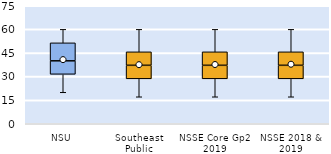
| Category | 25th | 50th | 75th |
|---|---|---|---|
| NSU | 31.429 | 8.571 | 11.429 |
| Southeast Public | 28.571 | 8.571 | 8.571 |
| NSSE Core Gp2 2019 | 28.571 | 8.571 | 8.571 |
| NSSE 2018 & 2019 | 28.571 | 8.571 | 8.571 |